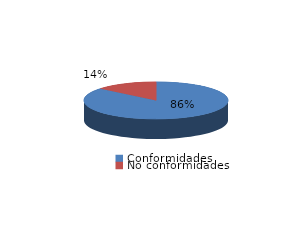
| Category | Series 0 |
|---|---|
| Conformidades | 868 |
| No conformidades | 141 |